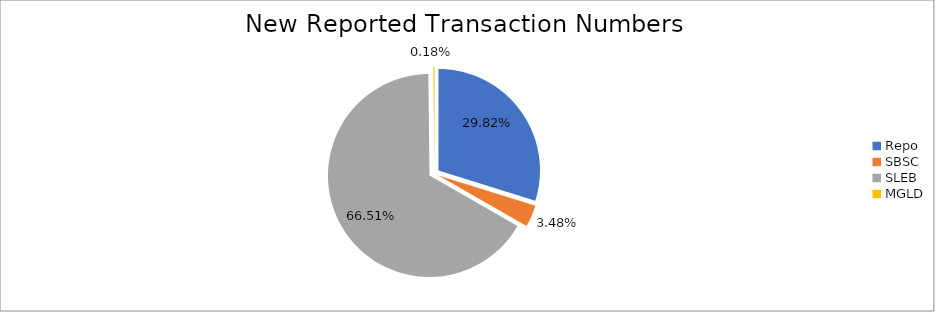
| Category | Series 0 |
|---|---|
| Repo | 399210 |
| SBSC | 46587 |
| SLEB | 890307 |
| MGLD | 2439 |